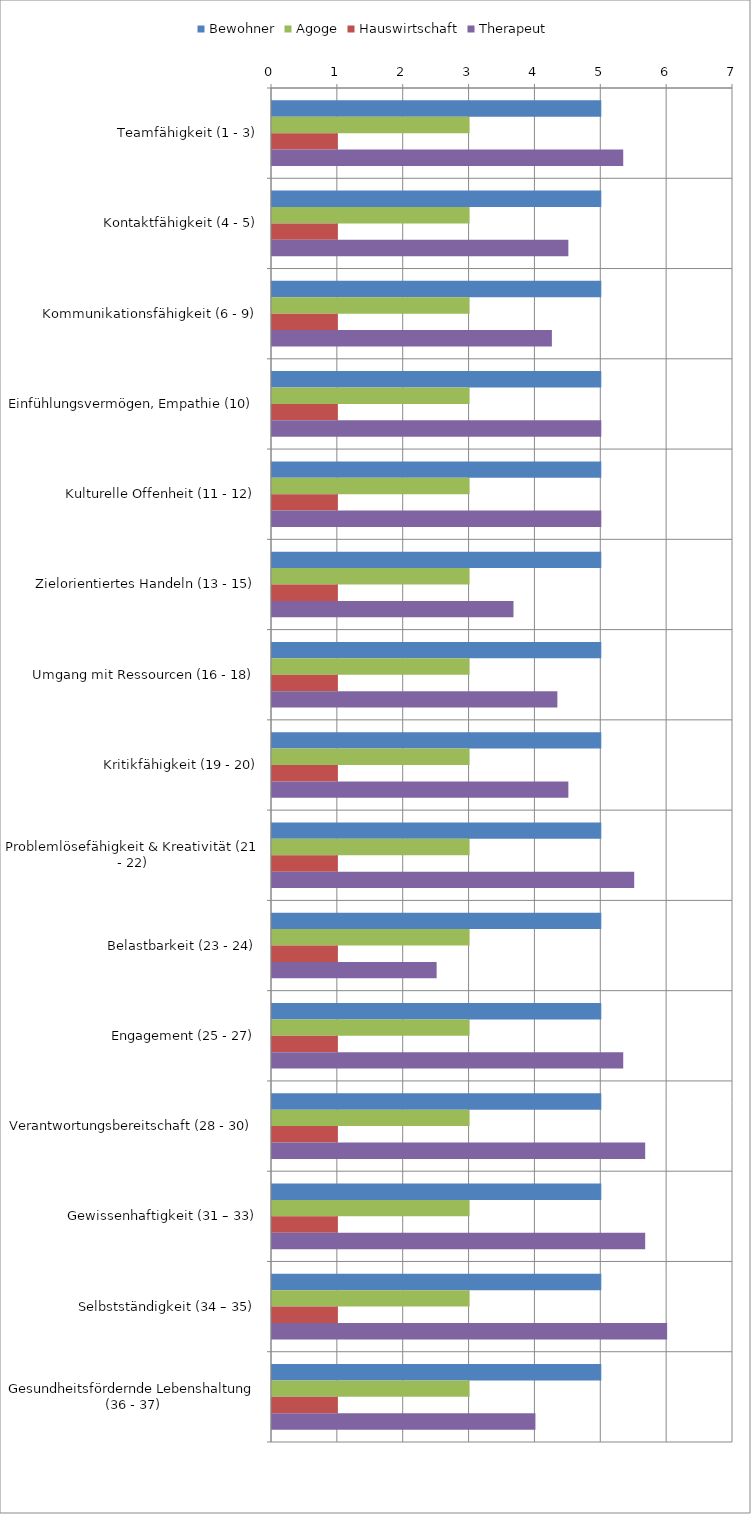
| Category | Bewohner | Agoge | Hauswirtschaft | Therapeut |
|---|---|---|---|---|
| Teamfähigkeit (1 - 3) | 5 | 3 | 1 | 5.333 |
| Kontaktfähigkeit (4 - 5) | 5 | 3 | 1 | 4.5 |
| Kommunikationsfähigkeit (6 - 9) | 5 | 3 | 1 | 4.25 |
| Einfühlungsvermögen, Empathie (10) | 5 | 3 | 1 | 5 |
| Kulturelle Offenheit (11 - 12) | 5 | 3 | 1 | 5 |
| Zielorientiertes Handeln (13 - 15) | 5 | 3 | 1 | 3.667 |
| Umgang mit Ressourcen (16 - 18) | 5 | 3 | 1 | 4.333 |
| Kritikfähigkeit (19 - 20) | 5 | 3 | 1 | 4.5 |
| Problemlösefähigkeit & Kreativität (21 - 22) | 5 | 3 | 1 | 5.5 |
| Belastbarkeit (23 - 24) | 5 | 3 | 1 | 2.5 |
| Engagement (25 - 27) | 5 | 3 | 1 | 5.333 |
| Verantwortungsbereitschaft (28 - 30) | 5 | 3 | 1 | 5.667 |
| Gewissenhaftigkeit (31 – 33) | 5 | 3 | 1 | 5.667 |
| Selbstständigkeit (34 – 35) | 5 | 3 | 1 | 6 |
| Gesundheitsfördernde Lebenshaltung (36 - 37) | 5 | 3 | 1 | 4 |